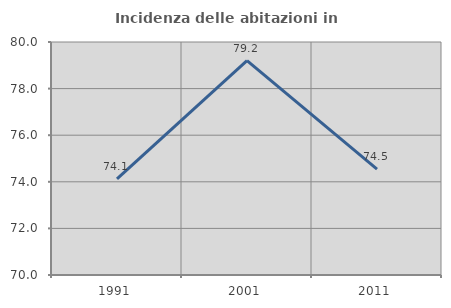
| Category | Incidenza delle abitazioni in proprietà  |
|---|---|
| 1991.0 | 74.123 |
| 2001.0 | 79.202 |
| 2011.0 | 74.541 |